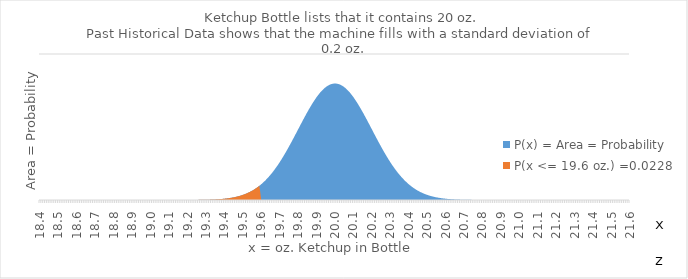
| Category | P(x) = Area = Probability |
|---|---|
| 18.4 | 0 |
| 18.41 | 0 |
| 18.42 | 0 |
| 18.430000000000003 | 0 |
| 18.440000000000005 | 0 |
| 18.450000000000006 | 0 |
| 18.460000000000008 | 0 |
| 18.47000000000001 | 0 |
| 18.48000000000001 | 0 |
| 18.490000000000013 | 0 |
| 18.500000000000014 | 0 |
| 18.510000000000016 | 0 |
| 18.520000000000017 | 0 |
| 18.53000000000002 | 0 |
| 18.54000000000002 | 0 |
| 18.550000000000022 | 0 |
| 18.560000000000024 | 0 |
| 18.570000000000025 | 0 |
| 18.580000000000027 | 0 |
| 18.59000000000003 | 0 |
| 18.60000000000003 | 0 |
| 18.61000000000003 | 0 |
| 18.620000000000033 | 0 |
| 18.630000000000035 | 0 |
| 18.640000000000036 | 0 |
| 18.650000000000038 | 0 |
| 18.66000000000004 | 0 |
| 18.67000000000004 | 0 |
| 18.680000000000042 | 0 |
| 18.690000000000044 | 0 |
| 18.700000000000045 | 0 |
| 18.710000000000047 | 0 |
| 18.72000000000005 | 0 |
| 18.73000000000005 | 0 |
| 18.74000000000005 | 0 |
| 18.750000000000053 | 0 |
| 18.760000000000055 | 0 |
| 18.770000000000056 | 0 |
| 18.780000000000058 | 0 |
| 18.79000000000006 | 0 |
| 18.80000000000006 | 0 |
| 18.810000000000063 | 0 |
| 18.820000000000064 | 0 |
| 18.830000000000066 | 0 |
| 18.840000000000067 | 0 |
| 18.85000000000007 | 0 |
| 18.86000000000007 | 0 |
| 18.870000000000072 | 0 |
| 18.880000000000074 | 0 |
| 18.890000000000075 | 0 |
| 18.900000000000077 | 0 |
| 18.91000000000008 | 0 |
| 18.92000000000008 | 0 |
| 18.93000000000008 | 0 |
| 18.940000000000083 | 0 |
| 18.950000000000085 | 0 |
| 18.960000000000086 | 0 |
| 18.970000000000088 | 0 |
| 18.98000000000009 | 0 |
| 18.99000000000009 | 0 |
| 19.000000000000092 | 0 |
| 19.010000000000094 | 0 |
| 19.020000000000095 | 0 |
| 19.030000000000097 | 0 |
| 19.0400000000001 | 0 |
| 19.0500000000001 | 0 |
| 19.0600000000001 | 0 |
| 19.070000000000103 | 0 |
| 19.080000000000105 | 0 |
| 19.090000000000106 | 0 |
| 19.100000000000108 | 0 |
| 19.11000000000011 | 0 |
| 19.12000000000011 | 0 |
| 19.130000000000113 | 0 |
| 19.140000000000114 | 0 |
| 19.150000000000116 | 0 |
| 19.160000000000117 | 0 |
| 19.17000000000012 | 0 |
| 19.18000000000012 | 0 |
| 19.190000000000122 | 0.001 |
| 19.200000000000124 | 0.001 |
| 19.210000000000125 | 0.001 |
| 19.220000000000127 | 0.001 |
| 19.23000000000013 | 0.001 |
| 19.24000000000013 | 0.001 |
| 19.25000000000013 | 0.002 |
| 19.260000000000133 | 0.002 |
| 19.270000000000135 | 0.003 |
| 19.280000000000136 | 0.003 |
| 19.290000000000138 | 0.004 |
| 19.30000000000014 | 0.004 |
| 19.31000000000014 | 0.005 |
| 19.320000000000142 | 0.006 |
| 19.330000000000144 | 0.007 |
| 19.340000000000146 | 0.009 |
| 19.350000000000147 | 0.01 |
| 19.36000000000015 | 0.012 |
| 19.37000000000015 | 0.014 |
| 19.38000000000015 | 0.016 |
| 19.390000000000153 | 0.019 |
| 19.400000000000155 | 0.022 |
| 19.410000000000156 | 0.026 |
| 19.420000000000158 | 0.03 |
| 19.43000000000016 | 0.034 |
| 19.44000000000016 | 0.04 |
| 19.450000000000163 | 0.045 |
| 19.460000000000164 | 0.052 |
| 19.470000000000166 | 0.06 |
| 19.480000000000167 | 0.068 |
| 19.49000000000017 | 0.077 |
| 19.50000000000017 | 0.088 |
| 19.510000000000172 | 0.099 |
| 19.520000000000174 | 0.112 |
| 19.530000000000175 | 0.126 |
| 19.540000000000177 | 0.142 |
| 19.55000000000018 | 0.159 |
| 19.56000000000018 | 0.177 |
| 19.57000000000018 | 0.198 |
| 19.580000000000183 | 0.22 |
| 19.590000000000185 | 0.244 |
| 19.600000000000186 | 0.27 |
| 19.610000000000188 | 0.298 |
| 19.62000000000019 | 0.328 |
| 19.63000000000019 | 0.36 |
| 19.640000000000192 | 0.395 |
| 19.650000000000194 | 0.431 |
| 19.660000000000196 | 0.47 |
| 19.670000000000197 | 0.511 |
| 19.6800000000002 | 0.555 |
| 19.6900000000002 | 0.6 |
| 19.700000000000202 | 0.648 |
| 19.710000000000203 | 0.697 |
| 19.720000000000205 | 0.749 |
| 19.730000000000206 | 0.802 |
| 19.740000000000208 | 0.857 |
| 19.75000000000021 | 0.913 |
| 19.76000000000021 | 0.971 |
| 19.770000000000213 | 1.03 |
| 19.780000000000214 | 1.089 |
| 19.790000000000216 | 1.149 |
| 19.800000000000217 | 1.21 |
| 19.81000000000022 | 1.27 |
| 19.82000000000022 | 1.33 |
| 19.830000000000222 | 1.39 |
| 19.840000000000224 | 1.448 |
| 19.850000000000225 | 1.506 |
| 19.860000000000227 | 1.561 |
| 19.87000000000023 | 1.615 |
| 19.88000000000023 | 1.666 |
| 19.89000000000023 | 1.715 |
| 19.900000000000233 | 1.76 |
| 19.910000000000235 | 1.803 |
| 19.920000000000236 | 1.841 |
| 19.930000000000238 | 1.876 |
| 19.94000000000024 | 1.907 |
| 19.95000000000024 | 1.933 |
| 19.960000000000242 | 1.955 |
| 19.970000000000244 | 1.972 |
| 19.980000000000246 | 1.985 |
| 19.990000000000247 | 1.992 |
| 20.00000000000025 | 1.995 |
| 20.01000000000025 | 1.992 |
| 20.020000000000252 | 1.985 |
| 20.030000000000253 | 1.972 |
| 20.040000000000255 | 1.955 |
| 20.050000000000257 | 1.933 |
| 20.060000000000258 | 1.907 |
| 20.07000000000026 | 1.876 |
| 20.08000000000026 | 1.841 |
| 20.090000000000263 | 1.803 |
| 20.100000000000264 | 1.76 |
| 20.110000000000266 | 1.715 |
| 20.120000000000267 | 1.666 |
| 20.13000000000027 | 1.615 |
| 20.14000000000027 | 1.561 |
| 20.150000000000272 | 1.506 |
| 20.160000000000274 | 1.448 |
| 20.170000000000275 | 1.39 |
| 20.180000000000277 | 1.33 |
| 20.19000000000028 | 1.27 |
| 20.20000000000028 | 1.21 |
| 20.21000000000028 | 1.149 |
| 20.220000000000283 | 1.089 |
| 20.230000000000285 | 1.03 |
| 20.240000000000286 | 0.971 |
| 20.250000000000288 | 0.913 |
| 20.26000000000029 | 0.857 |
| 20.27000000000029 | 0.802 |
| 20.280000000000292 | 0.749 |
| 20.290000000000294 | 0.697 |
| 20.300000000000296 | 0.648 |
| 20.310000000000297 | 0.6 |
| 20.3200000000003 | 0.555 |
| 20.3300000000003 | 0.511 |
| 20.340000000000302 | 0.47 |
| 20.350000000000303 | 0.431 |
| 20.360000000000305 | 0.395 |
| 20.370000000000307 | 0.36 |
| 20.380000000000308 | 0.328 |
| 20.39000000000031 | 0.298 |
| 20.40000000000031 | 0.27 |
| 20.410000000000313 | 0.244 |
| 20.420000000000314 | 0.22 |
| 20.430000000000316 | 0.198 |
| 20.440000000000317 | 0.177 |
| 20.45000000000032 | 0.159 |
| 20.46000000000032 | 0.142 |
| 20.470000000000322 | 0.126 |
| 20.480000000000324 | 0.112 |
| 20.490000000000325 | 0.099 |
| 20.500000000000327 | 0.088 |
| 20.51000000000033 | 0.077 |
| 20.52000000000033 | 0.068 |
| 20.53000000000033 | 0.06 |
| 20.540000000000333 | 0.052 |
| 20.550000000000335 | 0.045 |
| 20.560000000000336 | 0.04 |
| 20.570000000000338 | 0.034 |
| 20.58000000000034 | 0.03 |
| 20.59000000000034 | 0.026 |
| 20.600000000000342 | 0.022 |
| 20.610000000000344 | 0.019 |
| 20.620000000000346 | 0.016 |
| 20.630000000000347 | 0.014 |
| 20.64000000000035 | 0.012 |
| 20.65000000000035 | 0.01 |
| 20.660000000000352 | 0.009 |
| 20.670000000000353 | 0.007 |
| 20.680000000000355 | 0.006 |
| 20.690000000000357 | 0.005 |
| 20.700000000000358 | 0.004 |
| 20.71000000000036 | 0.004 |
| 20.72000000000036 | 0.003 |
| 20.730000000000363 | 0.003 |
| 20.740000000000364 | 0.002 |
| 20.750000000000366 | 0.002 |
| 20.760000000000367 | 0.001 |
| 20.77000000000037 | 0.001 |
| 20.78000000000037 | 0.001 |
| 20.790000000000372 | 0.001 |
| 20.800000000000374 | 0.001 |
| 20.810000000000375 | 0.001 |
| 20.820000000000377 | 0 |
| 20.83000000000038 | 0 |
| 20.84000000000038 | 0 |
| 20.85000000000038 | 0 |
| 20.860000000000383 | 0 |
| 20.870000000000385 | 0 |
| 20.880000000000386 | 0 |
| 20.890000000000388 | 0 |
| 20.90000000000039 | 0 |
| 20.91000000000039 | 0 |
| 20.920000000000393 | 0 |
| 20.930000000000394 | 0 |
| 20.940000000000396 | 0 |
| 20.950000000000397 | 0 |
| 20.9600000000004 | 0 |
| 20.9700000000004 | 0 |
| 20.980000000000402 | 0 |
| 20.990000000000403 | 0 |
| 21.000000000000405 | 0 |
| 21.010000000000407 | 0 |
| 21.020000000000408 | 0 |
| 21.03000000000041 | 0 |
| 21.04000000000041 | 0 |
| 21.050000000000413 | 0 |
| 21.060000000000414 | 0 |
| 21.070000000000416 | 0 |
| 21.080000000000418 | 0 |
| 21.09000000000042 | 0 |
| 21.10000000000042 | 0 |
| 21.110000000000422 | 0 |
| 21.120000000000424 | 0 |
| 21.130000000000425 | 0 |
| 21.140000000000427 | 0 |
| 21.15000000000043 | 0 |
| 21.16000000000043 | 0 |
| 21.17000000000043 | 0 |
| 21.180000000000433 | 0 |
| 21.190000000000435 | 0 |
| 21.200000000000436 | 0 |
| 21.210000000000438 | 0 |
| 21.22000000000044 | 0 |
| 21.23000000000044 | 0 |
| 21.240000000000443 | 0 |
| 21.250000000000444 | 0 |
| 21.260000000000446 | 0 |
| 21.270000000000447 | 0 |
| 21.28000000000045 | 0 |
| 21.29000000000045 | 0 |
| 21.300000000000452 | 0 |
| 21.310000000000453 | 0 |
| 21.320000000000455 | 0 |
| 21.330000000000457 | 0 |
| 21.340000000000458 | 0 |
| 21.35000000000046 | 0 |
| 21.36000000000046 | 0 |
| 21.370000000000463 | 0 |
| 21.380000000000464 | 0 |
| 21.390000000000466 | 0 |
| 21.400000000000468 | 0 |
| 21.41000000000047 | 0 |
| 21.42000000000047 | 0 |
| 21.430000000000472 | 0 |
| 21.440000000000474 | 0 |
| 21.450000000000475 | 0 |
| 21.460000000000477 | 0 |
| 21.47000000000048 | 0 |
| 21.48000000000048 | 0 |
| 21.49000000000048 | 0 |
| 21.500000000000483 | 0 |
| 21.510000000000485 | 0 |
| 21.520000000000486 | 0 |
| 21.530000000000488 | 0 |
| 21.54000000000049 | 0 |
| 21.55000000000049 | 0 |
| 21.560000000000493 | 0 |
| 21.570000000000494 | 0 |
| 21.580000000000496 | 0 |
| 21.590000000000497 | 0 |
| 21.6000000000005 | 0 |